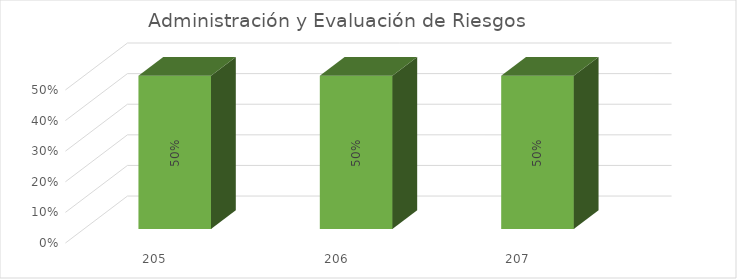
| Category | % Avance |
|---|---|
| 205.0 | 0.5 |
| 206.0 | 0.5 |
| 207.0 | 0.5 |